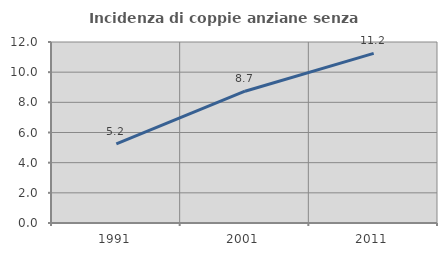
| Category | Incidenza di coppie anziane senza figli  |
|---|---|
| 1991.0 | 5.246 |
| 2001.0 | 8.738 |
| 2011.0 | 11.243 |